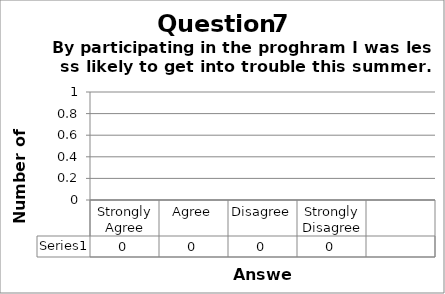
| Category | Series 0 |
|---|---|
| Strongly Agree | 0 |
| Agree | 0 |
| Disagree | 0 |
| Strongly Disagree | 0 |